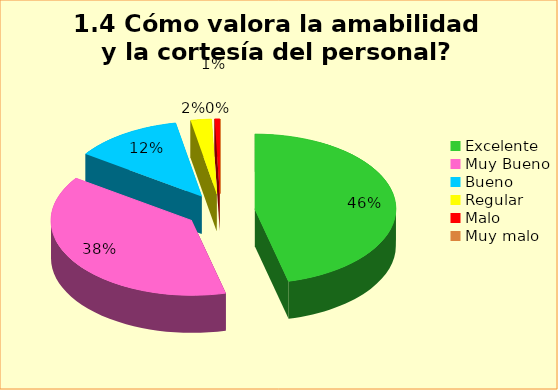
| Category | Series 0 |
|---|---|
| Excelente | 0.462 |
| Muy Bueno | 0.385 |
| Bueno  | 0.124 |
| Regular  | 0.024 |
| Malo  | 0.006 |
| Muy malo  | 0 |